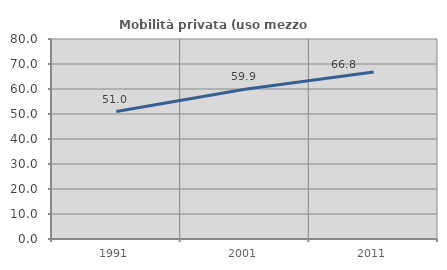
| Category | Mobilità privata (uso mezzo privato) |
|---|---|
| 1991.0 | 50.978 |
| 2001.0 | 59.87 |
| 2011.0 | 66.812 |